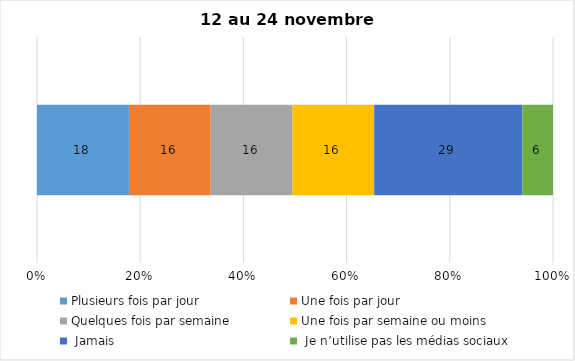
| Category | Plusieurs fois par jour | Une fois par jour | Quelques fois par semaine   | Une fois par semaine ou moins   |  Jamais   |  Je n’utilise pas les médias sociaux |
|---|---|---|---|---|---|---|
| 0 | 18 | 16 | 16 | 16 | 29 | 6 |